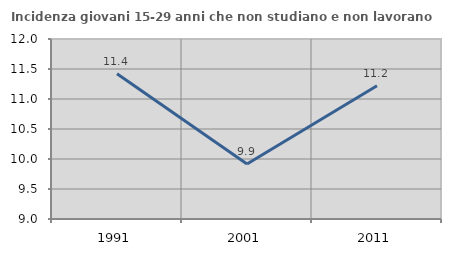
| Category | Incidenza giovani 15-29 anni che non studiano e non lavorano  |
|---|---|
| 1991.0 | 11.421 |
| 2001.0 | 9.916 |
| 2011.0 | 11.222 |